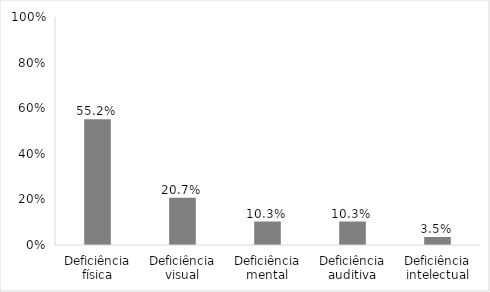
| Category | Series 0 |
|---|---|
| Deficiência física | 0.552 |
| Deficiência visual | 0.207 |
| Deficiência mental | 0.103 |
| Deficiência auditiva | 0.103 |
| Deficiência intelectual | 0.035 |